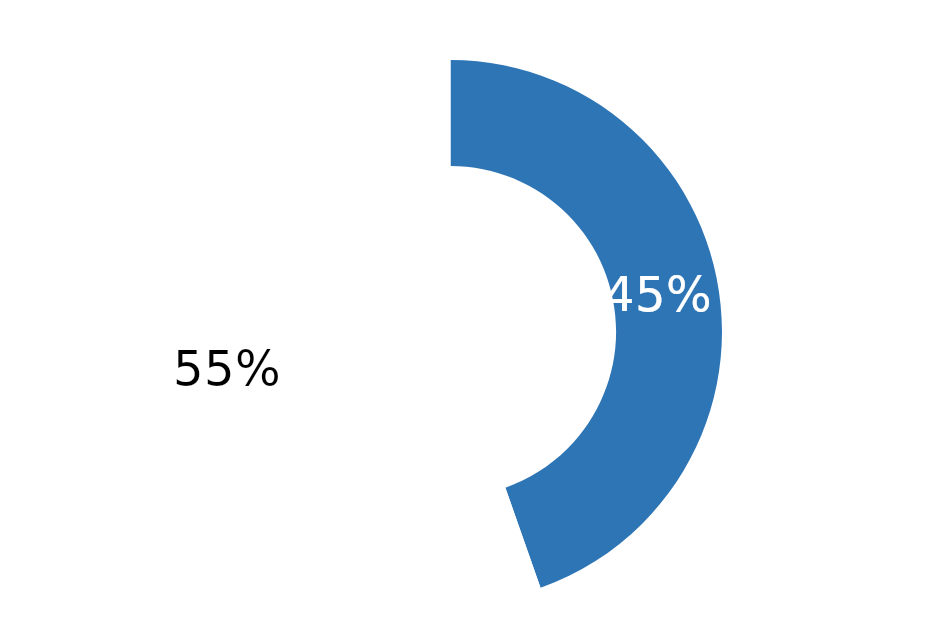
| Category | Series 0 |
|---|---|
| % Elapsed Time | 0.446 |
| % Remaining Time | 0.554 |